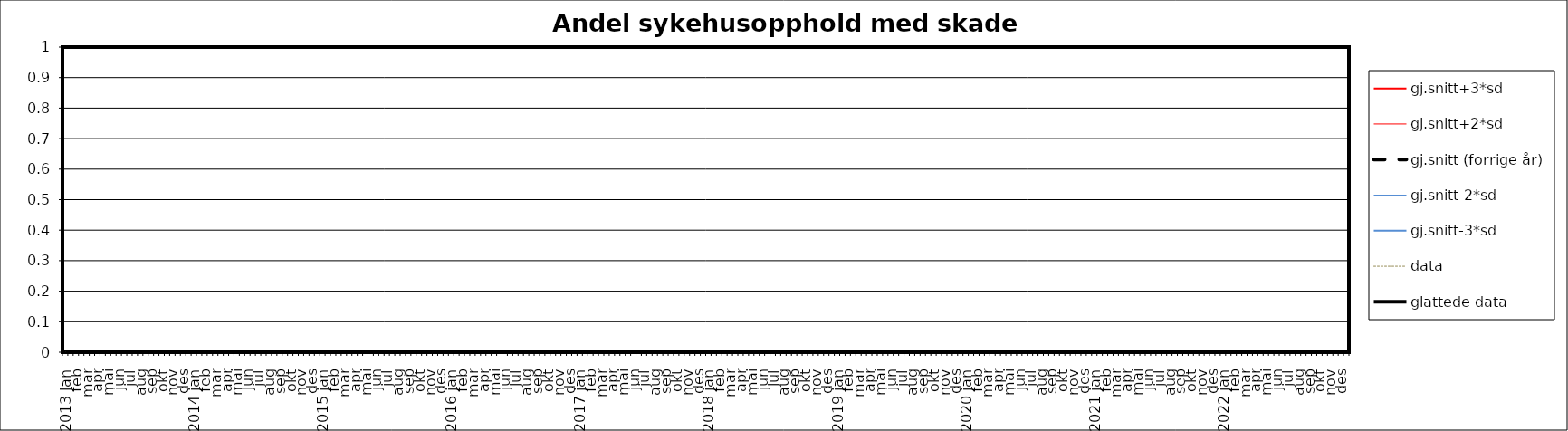
| Category | gj.snitt+3*sd | gj.snitt+2*sd | gj.snitt (forrige år) | gj.snitt-2*sd | gj.snitt-3*sd | data | glattede data |
|---|---|---|---|---|---|---|---|
| 2013 jan | 0 | 0 | 0 | 0 | 0 | 0 | 0 |
|  | 0 | 0 | 0 | 0 | 0 | 0 | 0 |
| feb | 0 | 0 | 0 | 0 | 0 | 0 | 0 |
|  | 0 | 0 | 0 | 0 | 0 | 0 | 0 |
| mar | 0 | 0 | 0 | 0 | 0 | 0 | 0 |
|  | 0 | 0 | 0 | 0 | 0 | 0 | 0 |
| apr | 0 | 0 | 0 | 0 | 0 | 0 | 0 |
|  | 0 | 0 | 0 | 0 | 0 | 0 | 0 |
| mai | 0 | 0 | 0 | 0 | 0 | 0 | 0 |
|  | 0 | 0 | 0 | 0 | 0 | 0 | 0 |
| jun | 0 | 0 | 0 | 0 | 0 | 0 | 0 |
|  | 0 | 0 | 0 | 0 | 0 | 0 | 0 |
| jul | 0 | 0 | 0 | 0 | 0 | 0 | 0 |
|  | 0 | 0 | 0 | 0 | 0 | 0 | 0 |
| aug | 0 | 0 | 0 | 0 | 0 | 0 | 0 |
|  | 0 | 0 | 0 | 0 | 0 | 0 | 0 |
| sep | 0 | 0 | 0 | 0 | 0 | 0 | 0 |
|  | 0 | 0 | 0 | 0 | 0 | 0 | 0 |
| okt | 0 | 0 | 0 | 0 | 0 | 0 | 0 |
|  | 0 | 0 | 0 | 0 | 0 | 0 | 0 |
| nov | 0 | 0 | 0 | 0 | 0 | 0 | 0 |
|  | 0 | 0 | 0 | 0 | 0 | 0 | 0 |
| des | 0 | 0 | 0 | 0 | 0 | 0 | 0 |
|  | 0 | 0 | 0 | 0 | 0 | 0 | 0 |
| 2014 jan | 0 | 0 | 0 | 0 | 0 | 0 | 0 |
|  | 0 | 0 | 0 | 0 | 0 | 0 | 0 |
| feb | 0 | 0 | 0 | 0 | 0 | 0 | 0 |
|  | 0 | 0 | 0 | 0 | 0 | 0 | 0 |
| mar | 0 | 0 | 0 | 0 | 0 | 0 | 0 |
|  | 0 | 0 | 0 | 0 | 0 | 0 | 0 |
| apr | 0 | 0 | 0 | 0 | 0 | 0 | 0 |
|  | 0 | 0 | 0 | 0 | 0 | 0 | 0 |
| mai | 0 | 0 | 0 | 0 | 0 | 0 | 0 |
|  | 0 | 0 | 0 | 0 | 0 | 0 | 0 |
| jun | 0 | 0 | 0 | 0 | 0 | 0 | 0 |
|  | 0 | 0 | 0 | 0 | 0 | 0 | 0 |
| jul | 0 | 0 | 0 | 0 | 0 | 0 | 0 |
|  | 0 | 0 | 0 | 0 | 0 | 0 | 0 |
| aug | 0 | 0 | 0 | 0 | 0 | 0 | 0 |
|  | 0 | 0 | 0 | 0 | 0 | 0 | 0 |
| sep | 0 | 0 | 0 | 0 | 0 | 0 | 0 |
|  | 0 | 0 | 0 | 0 | 0 | 0 | 0 |
| okt | 0 | 0 | 0 | 0 | 0 | 0 | 0 |
|  | 0 | 0 | 0 | 0 | 0 | 0 | 0 |
| nov | 0 | 0 | 0 | 0 | 0 | 0 | 0 |
|  | 0 | 0 | 0 | 0 | 0 | 0 | 0 |
| des | 0 | 0 | 0 | 0 | 0 | 0 | 0 |
|  | 0 | 0 | 0 | 0 | 0 | 0 | 0 |
| 2015 jan | 0 | 0 | 0 | 0 | 0 | 0 | 0 |
|  | 0 | 0 | 0 | 0 | 0 | 0 | 0 |
| feb | 0 | 0 | 0 | 0 | 0 | 0 | 0 |
|  | 0 | 0 | 0 | 0 | 0 | 0 | 0 |
| mar | 0 | 0 | 0 | 0 | 0 | 0 | 0 |
|  | 0 | 0 | 0 | 0 | 0 | 0 | 0 |
| apr | 0 | 0 | 0 | 0 | 0 | 0 | 0 |
|  | 0 | 0 | 0 | 0 | 0 | 0 | 0 |
| mai | 0 | 0 | 0 | 0 | 0 | 0 | 0 |
|  | 0 | 0 | 0 | 0 | 0 | 0 | 0 |
| jun | 0 | 0 | 0 | 0 | 0 | 0 | 0 |
|  | 0 | 0 | 0 | 0 | 0 | 0 | 0 |
| jul | 0 | 0 | 0 | 0 | 0 | 0 | 0 |
|  | 0 | 0 | 0 | 0 | 0 | 0 | 0 |
| aug | 0 | 0 | 0 | 0 | 0 | 0 | 0 |
|  | 0 | 0 | 0 | 0 | 0 | 0 | 0 |
| sep | 0 | 0 | 0 | 0 | 0 | 0 | 0 |
|  | 0 | 0 | 0 | 0 | 0 | 0 | 0 |
| okt | 0 | 0 | 0 | 0 | 0 | 0 | 0 |
|  | 0 | 0 | 0 | 0 | 0 | 0 | 0 |
| nov | 0 | 0 | 0 | 0 | 0 | 0 | 0 |
|  | 0 | 0 | 0 | 0 | 0 | 0 | 0 |
| des | 0 | 0 | 0 | 0 | 0 | 0 | 0 |
|  | 0 | 0 | 0 | 0 | 0 | 0 | 0 |
| 2016 jan | 0 | 0 | 0 | 0 | 0 | 0 | 0 |
|  | 0 | 0 | 0 | 0 | 0 | 0 | 0 |
| feb | 0 | 0 | 0 | 0 | 0 | 0 | 0 |
|  | 0 | 0 | 0 | 0 | 0 | 0 | 0 |
| mar | 0 | 0 | 0 | 0 | 0 | 0 | 0 |
|  | 0 | 0 | 0 | 0 | 0 | 0 | 0 |
| apr | 0 | 0 | 0 | 0 | 0 | 0 | 0 |
|  | 0 | 0 | 0 | 0 | 0 | 0 | 0 |
| mai | 0 | 0 | 0 | 0 | 0 | 0 | 0 |
|  | 0 | 0 | 0 | 0 | 0 | 0 | 0 |
| jun | 0 | 0 | 0 | 0 | 0 | 0 | 0 |
|  | 0 | 0 | 0 | 0 | 0 | 0 | 0 |
| jul | 0 | 0 | 0 | 0 | 0 | 0 | 0 |
|  | 0 | 0 | 0 | 0 | 0 | 0 | 0 |
| aug | 0 | 0 | 0 | 0 | 0 | 0 | 0 |
|  | 0 | 0 | 0 | 0 | 0 | 0 | 0 |
| sep | 0 | 0 | 0 | 0 | 0 | 0 | 0 |
|  | 0 | 0 | 0 | 0 | 0 | 0 | 0 |
| okt | 0 | 0 | 0 | 0 | 0 | 0 | 0 |
|  | 0 | 0 | 0 | 0 | 0 | 0 | 0 |
| nov | 0 | 0 | 0 | 0 | 0 | 0 | 0 |
|  | 0 | 0 | 0 | 0 | 0 | 0 | 0 |
| des | 0 | 0 | 0 | 0 | 0 | 0 | 0 |
|  | 0 | 0 | 0 | 0 | 0 | 0 | 0 |
| 2017 jan | 0 | 0 | 0 | 0 | 0 | 0 | 0 |
|  | 0 | 0 | 0 | 0 | 0 | 0 | 0 |
| feb | 0 | 0 | 0 | 0 | 0 | 0 | 0 |
|  | 0 | 0 | 0 | 0 | 0 | 0 | 0 |
| mar | 0 | 0 | 0 | 0 | 0 | 0 | 0 |
|  | 0 | 0 | 0 | 0 | 0 | 0 | 0 |
| apr | 0 | 0 | 0 | 0 | 0 | 0 | 0 |
|  | 0 | 0 | 0 | 0 | 0 | 0 | 0 |
| mai | 0 | 0 | 0 | 0 | 0 | 0 | 0 |
|  | 0 | 0 | 0 | 0 | 0 | 0 | 0 |
| jun | 0 | 0 | 0 | 0 | 0 | 0 | 0 |
|  | 0 | 0 | 0 | 0 | 0 | 0 | 0 |
| jul | 0 | 0 | 0 | 0 | 0 | 0 | 0 |
|  | 0 | 0 | 0 | 0 | 0 | 0 | 0 |
| aug | 0 | 0 | 0 | 0 | 0 | 0 | 0 |
|  | 0 | 0 | 0 | 0 | 0 | 0 | 0 |
| sep | 0 | 0 | 0 | 0 | 0 | 0 | 0 |
|  | 0 | 0 | 0 | 0 | 0 | 0 | 0 |
| okt | 0 | 0 | 0 | 0 | 0 | 0 | 0 |
|  | 0 | 0 | 0 | 0 | 0 | 0 | 0 |
| nov | 0 | 0 | 0 | 0 | 0 | 0 | 0 |
|  | 0 | 0 | 0 | 0 | 0 | 0 | 0 |
| des | 0 | 0 | 0 | 0 | 0 | 0 | 0 |
|  | 0 | 0 | 0 | 0 | 0 | 0 | 0 |
| 2018 jan | 0 | 0 | 0 | 0 | 0 | 0 | 0 |
|  | 0 | 0 | 0 | 0 | 0 | 0 | 0 |
| feb | 0 | 0 | 0 | 0 | 0 | 0 | 0 |
|  | 0 | 0 | 0 | 0 | 0 | 0 | 0 |
| mar | 0 | 0 | 0 | 0 | 0 | 0 | 0 |
|  | 0 | 0 | 0 | 0 | 0 | 0 | 0 |
| apr | 0 | 0 | 0 | 0 | 0 | 0 | 0 |
|  | 0 | 0 | 0 | 0 | 0 | 0 | 0 |
| mai | 0 | 0 | 0 | 0 | 0 | 0 | 0 |
|  | 0 | 0 | 0 | 0 | 0 | 0 | 0 |
| jun | 0 | 0 | 0 | 0 | 0 | 0 | 0 |
|  | 0 | 0 | 0 | 0 | 0 | 0 | 0 |
| jul | 0 | 0 | 0 | 0 | 0 | 0 | 0 |
|  | 0 | 0 | 0 | 0 | 0 | 0 | 0 |
| aug | 0 | 0 | 0 | 0 | 0 | 0 | 0 |
|  | 0 | 0 | 0 | 0 | 0 | 0 | 0 |
| sep | 0 | 0 | 0 | 0 | 0 | 0 | 0 |
|  | 0 | 0 | 0 | 0 | 0 | 0 | 0 |
| okt | 0 | 0 | 0 | 0 | 0 | 0 | 0 |
|  | 0 | 0 | 0 | 0 | 0 | 0 | 0 |
| nov | 0 | 0 | 0 | 0 | 0 | 0 | 0 |
|  | 0 | 0 | 0 | 0 | 0 | 0 | 0 |
| des | 0 | 0 | 0 | 0 | 0 | 0 | 0 |
|  | 0 | 0 | 0 | 0 | 0 | 0 | 0 |
| 2019 jan | 0 | 0 | 0 | 0 | 0 | 0 | 0 |
|  | 0 | 0 | 0 | 0 | 0 | 0 | 0 |
| feb | 0 | 0 | 0 | 0 | 0 | 0 | 0 |
|  | 0 | 0 | 0 | 0 | 0 | 0 | 0 |
| mar | 0 | 0 | 0 | 0 | 0 | 0 | 0 |
|  | 0 | 0 | 0 | 0 | 0 | 0 | 0 |
| apr | 0 | 0 | 0 | 0 | 0 | 0 | 0 |
|  | 0 | 0 | 0 | 0 | 0 | 0 | 0 |
| mai | 0 | 0 | 0 | 0 | 0 | 0 | 0 |
|  | 0 | 0 | 0 | 0 | 0 | 0 | 0 |
| jun | 0 | 0 | 0 | 0 | 0 | 0 | 0 |
|  | 0 | 0 | 0 | 0 | 0 | 0 | 0 |
| jul | 0 | 0 | 0 | 0 | 0 | 0 | 0 |
|  | 0 | 0 | 0 | 0 | 0 | 0 | 0 |
| aug | 0 | 0 | 0 | 0 | 0 | 0 | 0 |
|  | 0 | 0 | 0 | 0 | 0 | 0 | 0 |
| sep | 0 | 0 | 0 | 0 | 0 | 0 | 0 |
|  | 0 | 0 | 0 | 0 | 0 | 0 | 0 |
| okt | 0 | 0 | 0 | 0 | 0 | 0 | 0 |
|  | 0 | 0 | 0 | 0 | 0 | 0 | 0 |
| nov | 0 | 0 | 0 | 0 | 0 | 0 | 0 |
|  | 0 | 0 | 0 | 0 | 0 | 0 | 0 |
| des | 0 | 0 | 0 | 0 | 0 | 0 | 0 |
|  | 0 | 0 | 0 | 0 | 0 | 0 | 0 |
| 2020 jan | 0 | 0 | 0 | 0 | 0 | 0 | 0 |
|  | 0 | 0 | 0 | 0 | 0 | 0 | 0 |
| feb | 0 | 0 | 0 | 0 | 0 | 0 | 0 |
|  | 0 | 0 | 0 | 0 | 0 | 0 | 0 |
| mar | 0 | 0 | 0 | 0 | 0 | 0 | 0 |
|  | 0 | 0 | 0 | 0 | 0 | 0 | 0 |
| apr | 0 | 0 | 0 | 0 | 0 | 0 | 0 |
|  | 0 | 0 | 0 | 0 | 0 | 0 | 0 |
| mai | 0 | 0 | 0 | 0 | 0 | 0 | 0 |
|  | 0 | 0 | 0 | 0 | 0 | 0 | 0 |
| jun | 0 | 0 | 0 | 0 | 0 | 0 | 0 |
|  | 0 | 0 | 0 | 0 | 0 | 0 | 0 |
| jul | 0 | 0 | 0 | 0 | 0 | 0 | 0 |
|  | 0 | 0 | 0 | 0 | 0 | 0 | 0 |
| aug | 0 | 0 | 0 | 0 | 0 | 0 | 0 |
|  | 0 | 0 | 0 | 0 | 0 | 0 | 0 |
| sep | 0 | 0 | 0 | 0 | 0 | 0 | 0 |
|  | 0 | 0 | 0 | 0 | 0 | 0 | 0 |
| okt | 0 | 0 | 0 | 0 | 0 | 0 | 0 |
|  | 0 | 0 | 0 | 0 | 0 | 0 | 0 |
| nov | 0 | 0 | 0 | 0 | 0 | 0 | 0 |
|  | 0 | 0 | 0 | 0 | 0 | 0 | 0 |
| des | 0 | 0 | 0 | 0 | 0 | 0 | 0 |
|  | 0 | 0 | 0 | 0 | 0 | 0 | 0 |
| 2021 jan | 0 | 0 | 0 | 0 | 0 | 0 | 0 |
|  | 0 | 0 | 0 | 0 | 0 | 0 | 0 |
| feb | 0 | 0 | 0 | 0 | 0 | 0 | 0 |
|  | 0 | 0 | 0 | 0 | 0 | 0 | 0 |
| mar | 0 | 0 | 0 | 0 | 0 | 0 | 0 |
|  | 0 | 0 | 0 | 0 | 0 | 0 | 0 |
| apr | 0 | 0 | 0 | 0 | 0 | 0 | 0 |
|  | 0 | 0 | 0 | 0 | 0 | 0 | 0 |
| mai | 0 | 0 | 0 | 0 | 0 | 0 | 0 |
|  | 0 | 0 | 0 | 0 | 0 | 0 | 0 |
| jun | 0 | 0 | 0 | 0 | 0 | 0 | 0 |
|  | 0 | 0 | 0 | 0 | 0 | 0 | 0 |
| jul | 0 | 0 | 0 | 0 | 0 | 0 | 0 |
|  | 0 | 0 | 0 | 0 | 0 | 0 | 0 |
| aug | 0 | 0 | 0 | 0 | 0 | 0 | 0 |
|  | 0 | 0 | 0 | 0 | 0 | 0 | 0 |
| sep | 0 | 0 | 0 | 0 | 0 | 0 | 0 |
|  | 0 | 0 | 0 | 0 | 0 | 0 | 0 |
| okt | 0 | 0 | 0 | 0 | 0 | 0 | 0 |
|  | 0 | 0 | 0 | 0 | 0 | 0 | 0 |
| nov | 0 | 0 | 0 | 0 | 0 | 0 | 0 |
|  | 0 | 0 | 0 | 0 | 0 | 0 | 0 |
| des | 0 | 0 | 0 | 0 | 0 | 0 | 0 |
|  | 0 | 0 | 0 | 0 | 0 | 0 | 0 |
| 2022 jan | 0 | 0 | 0 | 0 | 0 | 0 | 0 |
|  | 0 | 0 | 0 | 0 | 0 | 0 | 0 |
| feb | 0 | 0 | 0 | 0 | 0 | 0 | 0 |
|  | 0 | 0 | 0 | 0 | 0 | 0 | 0 |
| mar | 0 | 0 | 0 | 0 | 0 | 0 | 0 |
|  | 0 | 0 | 0 | 0 | 0 | 0 | 0 |
| apr | 0 | 0 | 0 | 0 | 0 | 0 | 0 |
|  | 0 | 0 | 0 | 0 | 0 | 0 | 0 |
| mai | 0 | 0 | 0 | 0 | 0 | 0 | 0 |
|  | 0 | 0 | 0 | 0 | 0 | 0 | 0 |
| jun | 0 | 0 | 0 | 0 | 0 | 0 | 0 |
|  | 0 | 0 | 0 | 0 | 0 | 0 | 0 |
| jul | 0 | 0 | 0 | 0 | 0 | 0 | 0 |
|  | 0 | 0 | 0 | 0 | 0 | 0 | 0 |
| aug | 0 | 0 | 0 | 0 | 0 | 0 | 0 |
|  | 0 | 0 | 0 | 0 | 0 | 0 | 0 |
| sep | 0 | 0 | 0 | 0 | 0 | 0 | 0 |
|  | 0 | 0 | 0 | 0 | 0 | 0 | 0 |
| okt | 0 | 0 | 0 | 0 | 0 | 0 | 0 |
|  | 0 | 0 | 0 | 0 | 0 | 0 | 0 |
| nov | 0 | 0 | 0 | 0 | 0 | 0 | 0 |
|  | 0 | 0 | 0 | 0 | 0 | 0 | 0 |
| des | 0 | 0 | 0 | 0 | 0 | 0 | 0 |